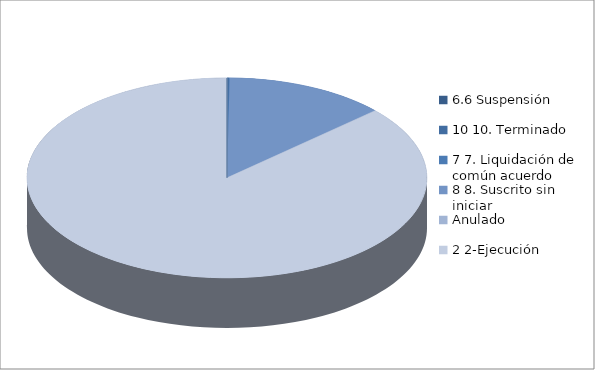
| Category | Series 0 |
|---|---|
| 6.6 Suspensión | 0 |
| 10 10. Terminado | 1 |
| 7 7. Liquidación de común acuerdo | 0 |
| 8 8. Suscrito sin iniciar | 62 |
| Anulado | 0 |
| 2 2-Ejecución | 412 |